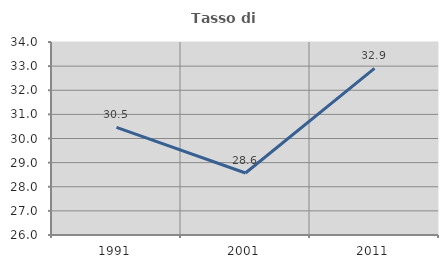
| Category | Tasso di occupazione   |
|---|---|
| 1991.0 | 30.462 |
| 2001.0 | 28.571 |
| 2011.0 | 32.905 |